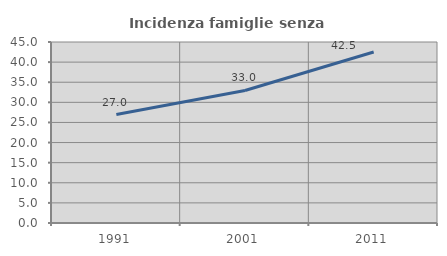
| Category | Incidenza famiglie senza nuclei |
|---|---|
| 1991.0 | 26.952 |
| 2001.0 | 32.951 |
| 2011.0 | 42.508 |